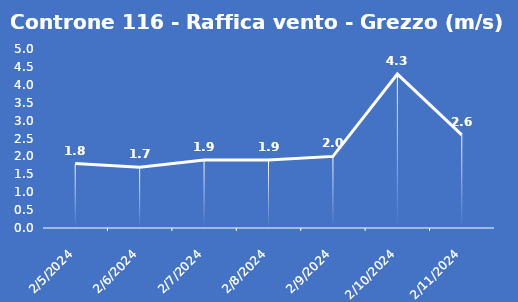
| Category | Controne 116 - Raffica vento - Grezzo (m/s) |
|---|---|
| 2/5/24 | 1.8 |
| 2/6/24 | 1.7 |
| 2/7/24 | 1.9 |
| 2/8/24 | 1.9 |
| 2/9/24 | 2 |
| 2/10/24 | 4.3 |
| 2/11/24 | 2.6 |